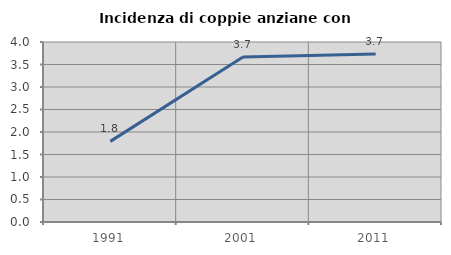
| Category | Incidenza di coppie anziane con figli |
|---|---|
| 1991.0 | 1.792 |
| 2001.0 | 3.668 |
| 2011.0 | 3.731 |